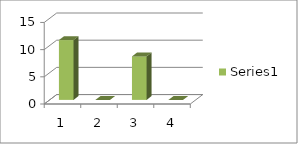
| Category | Series 0 |
|---|---|
| 0 | 11 |
| 1 | 0 |
| 2 | 8 |
| 3 | 0 |